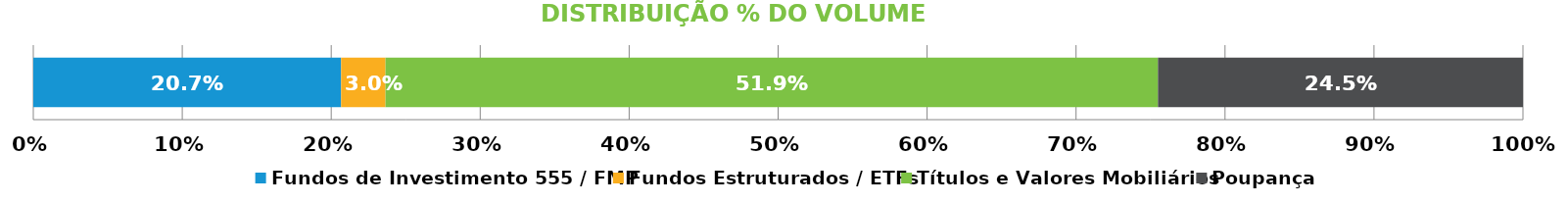
| Category | Fundos de Investimento 555 / FMP | Fundos Estruturados / ETFs | Títulos e Valores Mobiliários | Poupança |
|---|---|---|---|---|
| 0 | 0.207 | 0.03 | 0.519 | 0.245 |